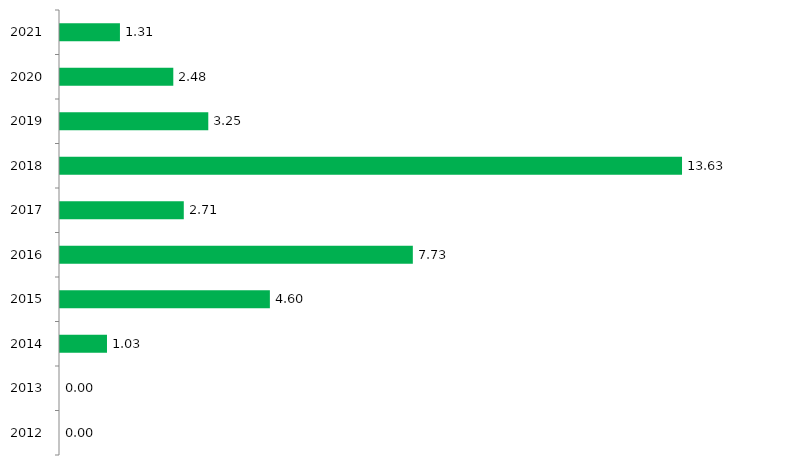
| Category | Series 1 |
|---|---|
| 2012.0 | 0 |
| 2013.0 | 0 |
| 2014.0 | 1.03 |
| 2015.0 | 4.6 |
| 2016.0 | 7.733 |
| 2017.0 | 2.713 |
| 2018.0 | 13.633 |
| 2019.0 | 3.25 |
| 2020.0 | 2.483 |
| 2021.0 | 1.314 |